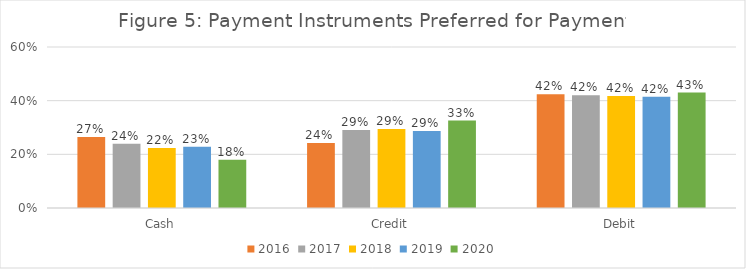
| Category | 2016 | 2017 | 2018 | 2019 | 2020 |
|---|---|---|---|---|---|
| Cash | 0.265 | 0.239 | 0.224 | 0.228 | 0.18 |
| Credit | 0.242 | 0.291 | 0.294 | 0.287 | 0.326 |
| Debit | 0.424 | 0.42 | 0.417 | 0.415 | 0.43 |